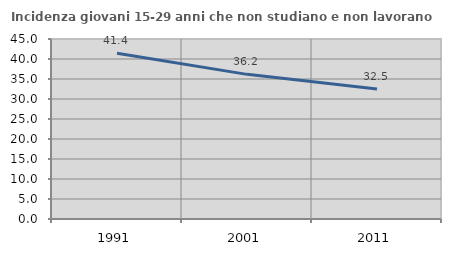
| Category | Incidenza giovani 15-29 anni che non studiano e non lavorano  |
|---|---|
| 1991.0 | 41.423 |
| 2001.0 | 36.16 |
| 2011.0 | 32.527 |